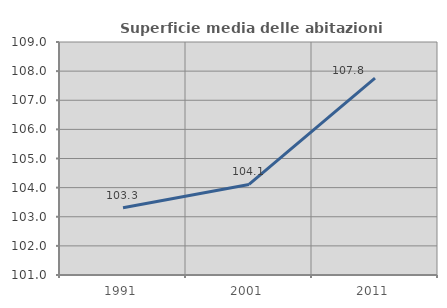
| Category | Superficie media delle abitazioni occupate |
|---|---|
| 1991.0 | 103.308 |
| 2001.0 | 104.109 |
| 2011.0 | 107.762 |